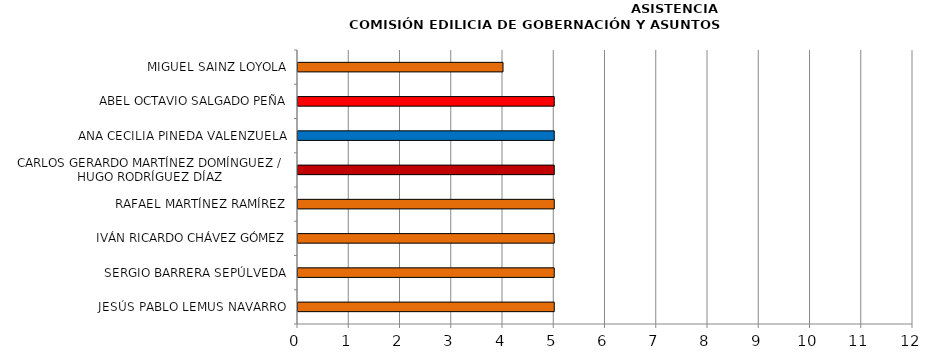
| Category | Series 0 |
|---|---|
| JESÚS PABLO LEMUS NAVARRO | 5 |
| SERGIO BARRERA SEPÚLVEDA | 5 |
| IVÁN RICARDO CHÁVEZ GÓMEZ | 5 |
| RAFAEL MARTÍNEZ RAMÍREZ | 5 |
| CARLOS GERARDO MARTÍNEZ DOMÍNGUEZ /
HUGO RODRÍGUEZ DÍAZ | 5 |
| ANA CECILIA PINEDA VALENZUELA | 5 |
| ABEL OCTAVIO SALGADO PEÑA | 5 |
| MIGUEL SAINZ LOYOLA | 4 |